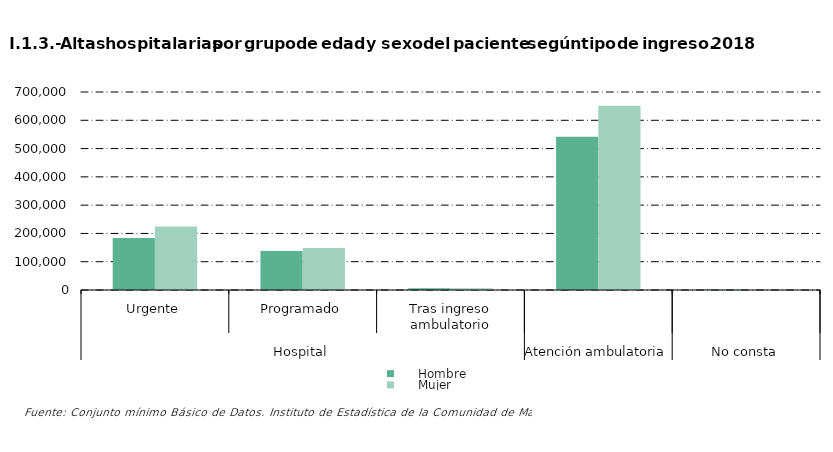
| Category |      Hombre |      Mujer |
|---|---|---|
| 0 | 184061 | 224567 |
| 1 | 138203 | 148850 |
| 2 | 6552 | 6151 |
| 3 | 541901 | 651638 |
| 4 | 471 | 377 |